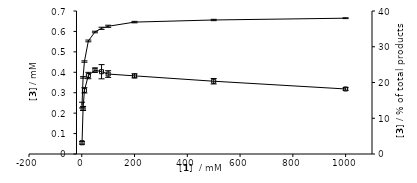
| Category | Series 0 |
|---|---|
| 1.0 | 0.055 |
| 5.0 | 0.223 |
| 10.0 | 0.312 |
| 25.0 | 0.384 |
| 50.0 | 0.41 |
| 75.0 | 0.403 |
| 100.0 | 0.391 |
| 200.0 | 0.382 |
| 500.0 | 0.356 |
| 1000.0 | 0.318 |